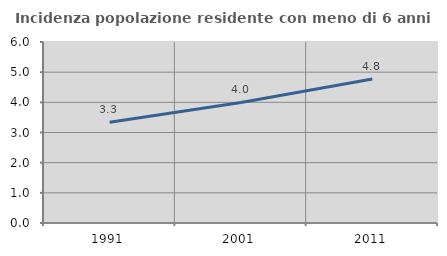
| Category | Incidenza popolazione residente con meno di 6 anni |
|---|---|
| 1991.0 | 3.339 |
| 2001.0 | 3.997 |
| 2011.0 | 4.777 |